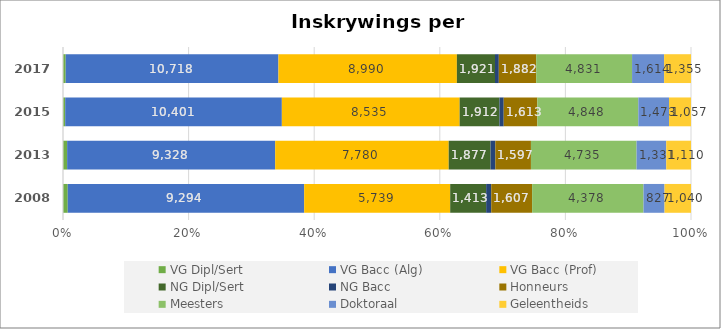
| Category | VG Dipl/Sert | VG Bacc (Alg) | VG Bacc (Prof) | NG Dipl/Sert | NG Bacc | Honneurs | Meesters | Doktoraal | Geleentheids |
|---|---|---|---|---|---|---|---|---|---|
| 2008 | 186 | 9294 | 5739 | 1413 | 200 | 1607 | 4378 | 827 | 1040 |
| 2013 | 185 | 9328 | 7780 | 1877 | 213 | 1597 | 4735 | 1331 | 1110 |
| 2015 | 106 | 10401 | 8535 | 1912 | 205 | 1613 | 4848 | 1473 | 1057 |
| 2017 | 136 | 10718 | 8990 | 1921 | 192 | 1882 | 4831 | 1614 | 1355 |